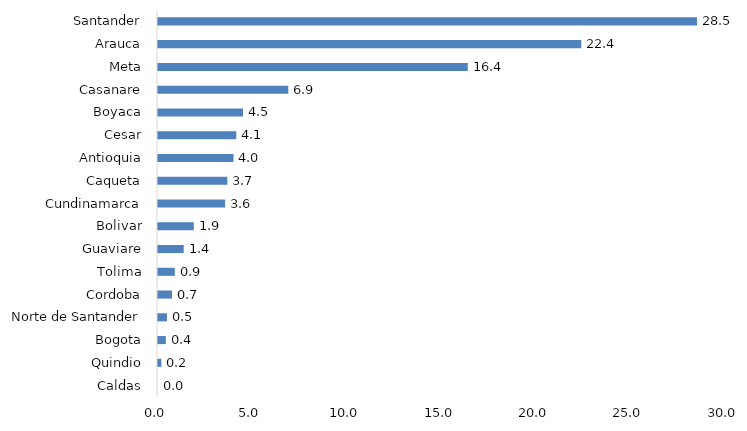
| Category | Series 0 |
|---|---|
| Caldas | 0 |
| Quindio | 0.178 |
| Bogota | 0.414 |
| Norte de Santander | 0.473 |
| Cordoba | 0.74 |
| Tolima | 0.888 |
| Guaviare | 1.361 |
| Bolivar | 1.893 |
| Cundinamarca | 3.55 |
| Caqueta | 3.669 |
| Antioquia | 3.994 |
| Cesar | 4.142 |
| Boyaca | 4.497 |
| Casanare | 6.893 |
| Meta | 16.391 |
| Arauca | 22.396 |
| Santander | 28.521 |